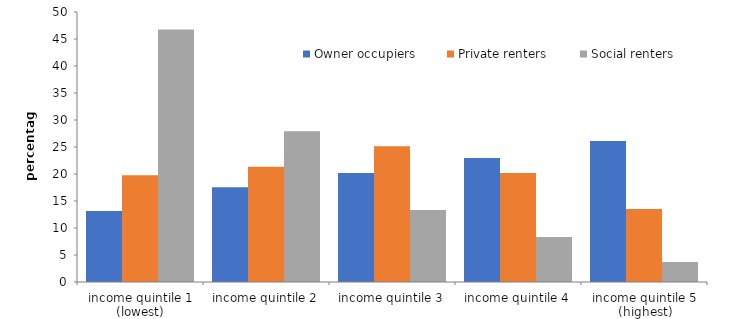
| Category | Owner occupiers | Private renters | Social renters |
|---|---|---|---|
| income quintile 1 (lowest) | 13.153 | 19.79 | 46.748 |
| income quintile 2 | 17.541 | 21.341 | 27.903 |
| income quintile 3 | 20.199 | 25.147 | 13.321 |
| income quintile 4 | 22.979 | 20.19 | 8.319 |
| income quintile 5 (highest) | 26.128 | 13.532 | 3.709 |